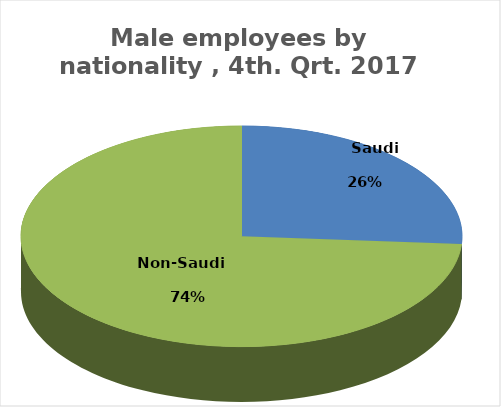
| Category | Series 0 |
|---|---|
|        Saudi      | 1577974 |
|          Non-Saudi        | 4466397 |